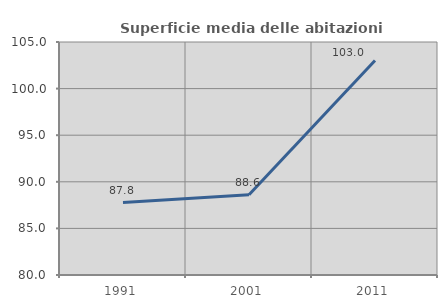
| Category | Superficie media delle abitazioni occupate |
|---|---|
| 1991.0 | 87.773 |
| 2001.0 | 88.601 |
| 2011.0 | 103.01 |